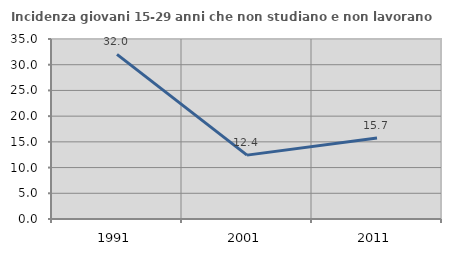
| Category | Incidenza giovani 15-29 anni che non studiano e non lavorano  |
|---|---|
| 1991.0 | 32.022 |
| 2001.0 | 12.422 |
| 2011.0 | 15.746 |